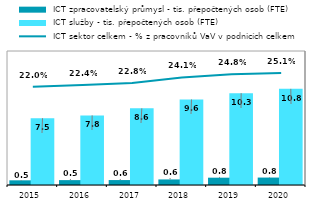
| Category |  ICT zpracovatelský průmysl - tis. přepočtených osob (FTE) |  ICT služby - tis. přepočtených osob (FTE) |
|---|---|---|
| 2015.0 | 0.523 | 7.472 |
| 2016.0 | 0.546 | 7.793 |
| 2017.0 | 0.553 | 8.578 |
| 2018.0 | 0.623 | 9.573 |
| 2019.0 | 0.818 | 10.284 |
| 2020.0 | 0.832 | 10.76 |